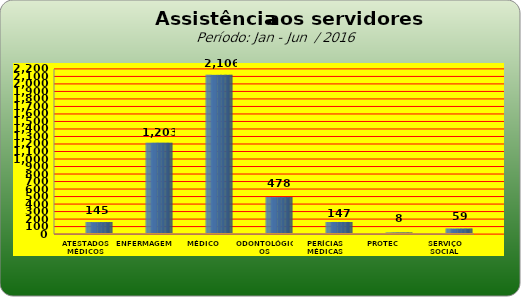
| Category | Series 0 |
|---|---|
| ATESTADOS MÉDICOS | 145 |
| ENFERMAGEM | 1203 |
| MÉDICO | 2106 |
| ODONTOLÓGICOS | 478 |
| PERÍCIAS MÉDICAS | 147 |
| PROTEC | 8 |
| SERVIÇO SOCIAL | 59 |